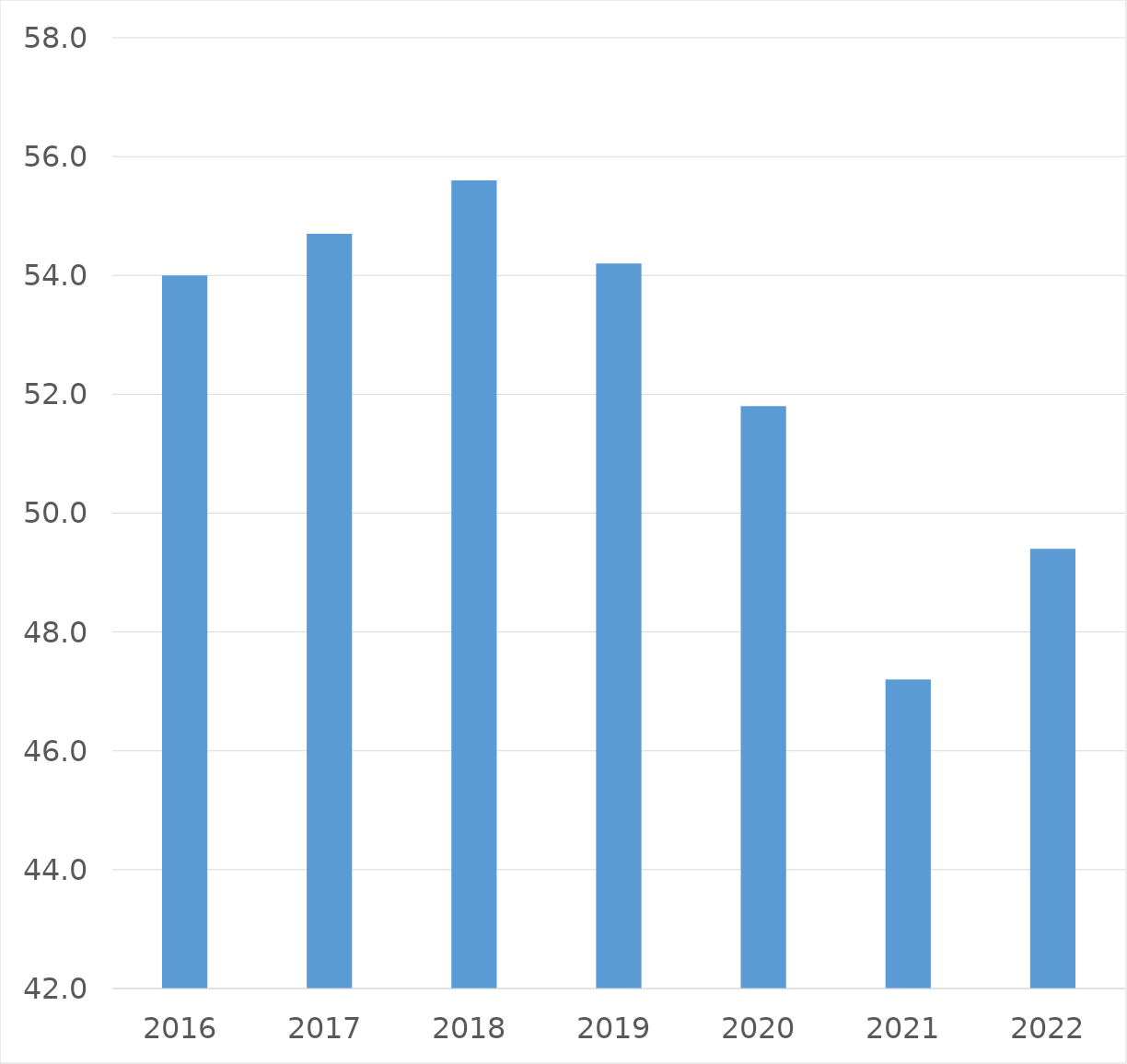
| Category | Series 0 |
|---|---|
| 2016 | 54 |
| 2017 | 54.7 |
| 2018 | 55.6 |
| 2019 | 54.2 |
| 2020 | 51.8 |
| 2021 | 47.2 |
| 2022 | 49.4 |